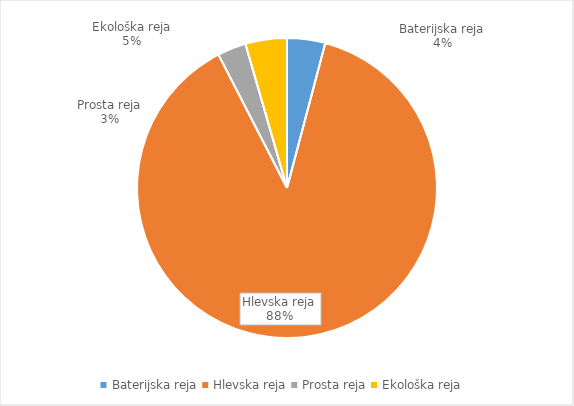
| Category | Količina kosov jajc |
|---|---|
| Baterijska reja | 135820 |
| Hlevska reja | 2916985 |
| Prosta reja | 102058 |
| Ekološka reja | 147540 |